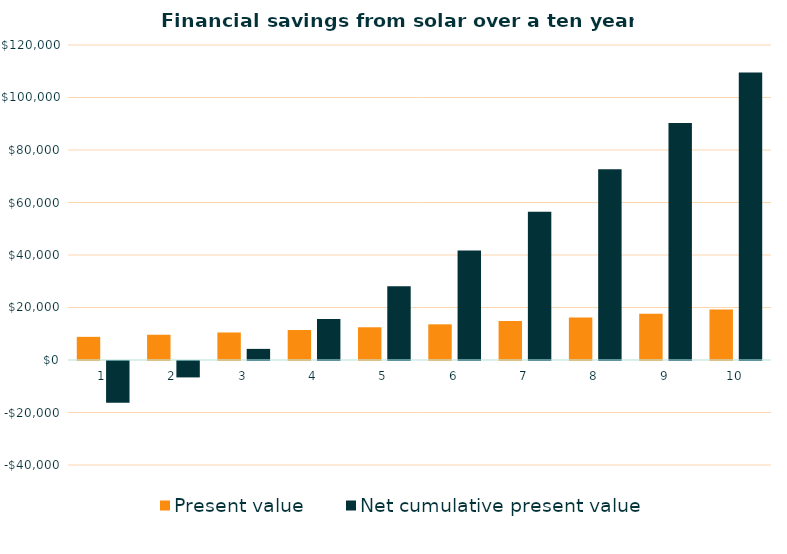
| Category | Present value | Net cumulative present value |
|---|---|---|
| 0 | 8819.453 | -15866.261 |
| 1 | 9615.549 | -6250.712 |
| 2 | 10483.506 | 4232.794 |
| 3 | 11429.81 | 15662.604 |
| 4 | 12461.532 | 28124.136 |
| 5 | 13586.385 | 41710.521 |
| 6 | 14812.773 | 56523.293 |
| 7 | 16149.862 | 72673.155 |
| 8 | 17607.644 | 90280.799 |
| 9 | 19197.015 | 109477.815 |